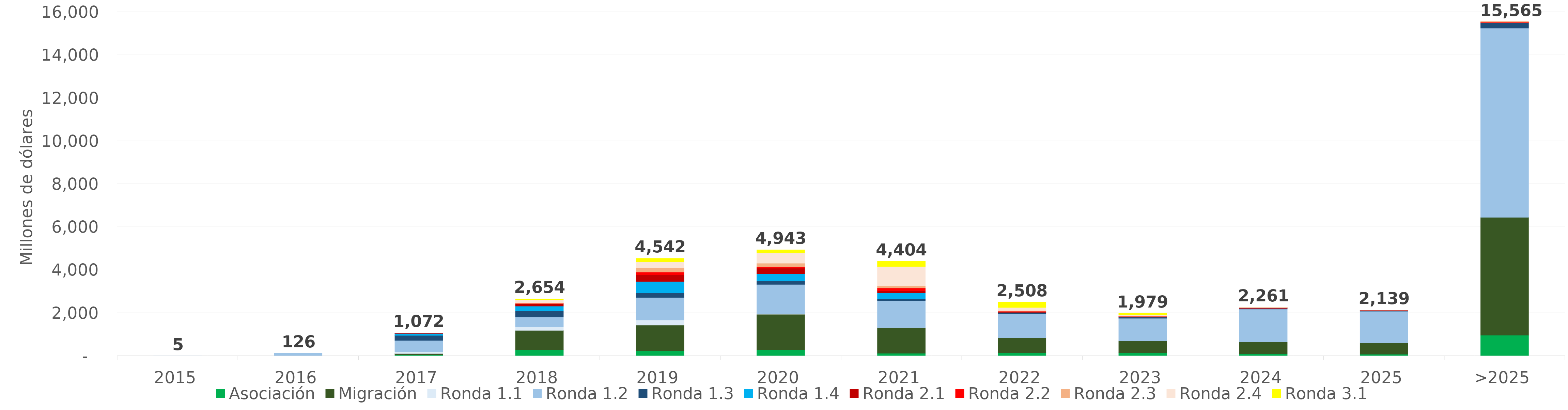
| Category | Asociación | Migración | Ronda 1.1 | Ronda 1.2 | Ronda 1.3 | Ronda 1.4 | Ronda 2.1 | Ronda 2.2 | Ronda 2.3 | Ronda 2.4 | Ronda 3.1 |
|---|---|---|---|---|---|---|---|---|---|---|---|
| 2015 | 0 | 0 | 4.573 | 0.236 | 0 | 0 | 0 | 0 | 0 | 0 | 0 |
| 2016 | 0 | 0 | 16.79 | 108.909 | 0 | 0 | 0 | 0 | 0 | 0 | 0 |
| 2017 | 50.877 | 65.422 | 76.429 | 533.486 | 231.789 | 93.443 | 18.851 | 1.29 | 0.72 | 0 | 0 |
| 2018 | 289.394 | 902.921 | 155.042 | 470.128 | 278.302 | 226.903 | 104.896 | 21.902 | 26.974 | 139.641 | 37.691 |
| 2019 | 241.207 | 1195.818 | 236.68 | 1049.68 | 207.126 | 540.649 | 302.09 | 133.009 | 199.161 | 270.262 | 166.186 |
| 2020 | 284.321 | 1655.641 | 6.736 | 1382.287 | 161.213 | 341.057 | 252.645 | 70.216 | 163.112 | 477.469 | 148.013 |
| 2021 | 127.797 | 1192.243 | 2.229 | 1245.799 | 90.024 | 274.593 | 106.762 | 125.814 | 97.175 | 902.96 | 238.989 |
| 2022 | 156.368 | 689.457 | 0 | 1116.823 | 55.367 | 10.69 | 22.691 | 33.254 | 30.541 | 142.246 | 250.81 |
| 2023 | 147.065 | 555.219 | 0 | 1053.188 | 52.504 | 0.73 | 0.019 | 37.005 | 21.555 | 47.441 | 63.845 |
| 2024 | 95.997 | 553.791 | 0 | 1533.703 | 34.867 | 0 | 0 | 27.408 | 14.136 | 1.529 | 0 |
| 2025 | 85.063 | 530.69 | 0 | 1469.047 | 35.989 | 0 | 0 | 10.138 | 8.511 | 0 | 0 |
| >2025 | 967.234 | 5485.433 | 0 | 8797.137 | 255.34 | 0 | 0 | 24.866 | 34.959 | 0 | 0 |